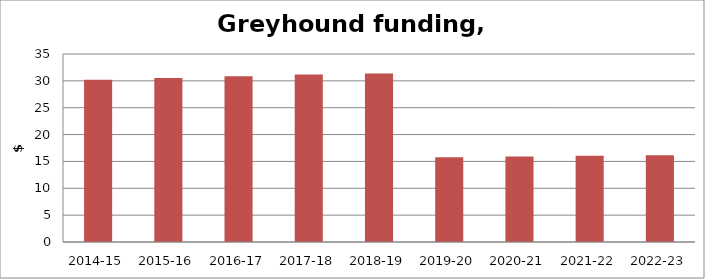
| Category | Series 0 |
|---|---|
| 2014-15 | 30.207 |
| 2015-16 | 30.51 |
| 2016-17 | 30.85 |
| 2017-18 | 31.176 |
| 2018-19 | 31.376 |
| 2019-20 | 15.791 |
| 2020-21 | 15.915 |
| 2021-22 | 16.039 |
| 2022-23 | 16.167 |